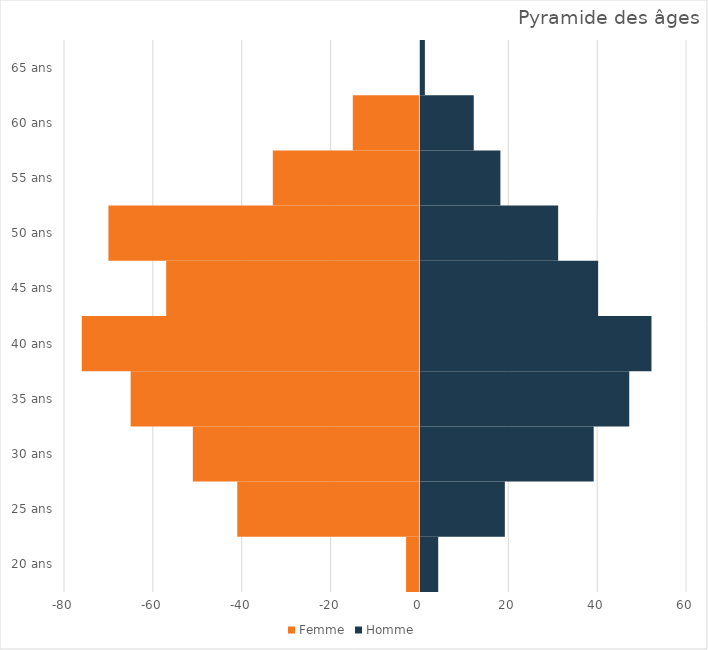
| Category | Femme | Homme |
|---|---|---|
| 20 ans | -3 | 4 |
| 25 ans | -41 | 19 |
| 30 ans | -51 | 39 |
| 35 ans | -65 | 47 |
| 40 ans | -76 | 52 |
| 45 ans | -57 | 40 |
| 50 ans | -70 | 31 |
| 55 ans | -33 | 18 |
| 60 ans | -15 | 12 |
| 65 ans | 0 | 1 |